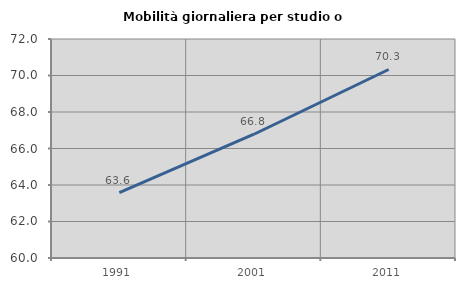
| Category | Mobilità giornaliera per studio o lavoro |
|---|---|
| 1991.0 | 63.584 |
| 2001.0 | 66.781 |
| 2011.0 | 70.33 |